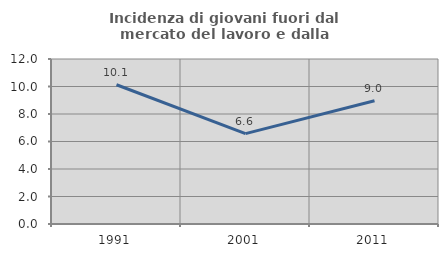
| Category | Incidenza di giovani fuori dal mercato del lavoro e dalla formazione  |
|---|---|
| 1991.0 | 10.126 |
| 2001.0 | 6.571 |
| 2011.0 | 8.969 |